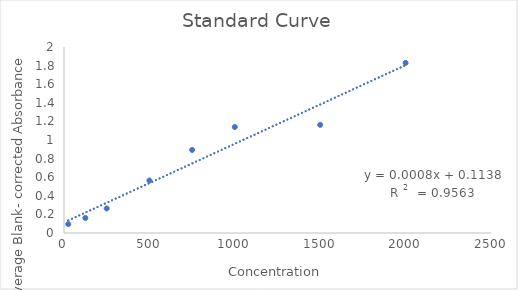
| Category | VALUE |
|---|---|
| 2000.0 | 1.83 |
| 1500.0 | 1.163 |
| 1000.0 | 1.14 |
| 750.0 | 0.893 |
| 500.0 | 0.564 |
| 250.0 | 0.264 |
| 125.0 | 0.162 |
| 25.0 | 0.096 |